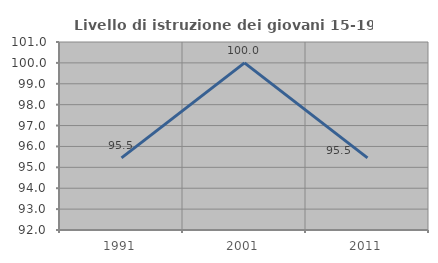
| Category | Livello di istruzione dei giovani 15-19 anni |
|---|---|
| 1991.0 | 95.455 |
| 2001.0 | 100 |
| 2011.0 | 95.455 |